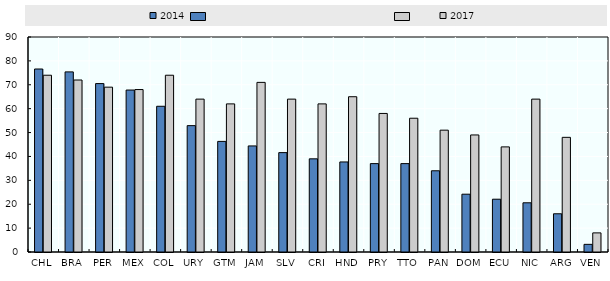
| Category | 2014 | 2017 |
|---|---|---|
| CHL | 76.6 | 74 |
| BRA | 75.4 | 72 |
| PER | 70.5 | 69 |
| MEX | 67.8 | 68 |
| COL | 61 | 74 |
| URY | 52.9 | 64 |
| GTM | 46.3 | 62 |
| JAM | 44.4 | 71 |
| SLV | 41.6 | 64 |
| CRI | 39 | 62 |
| HND | 37.7 | 65 |
| PRY | 37 | 58 |
| TTO | 37 | 56 |
| PAN | 34 | 51 |
| DOM | 24.2 | 49 |
| ECU | 22.1 | 44 |
| NIC | 20.6 | 64 |
| ARG | 16 | 48 |
| VEN | 3.2 | 8 |